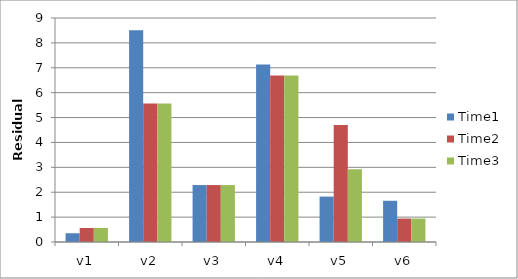
| Category | Time1 | Time2 | Time3 |
|---|---|---|---|
| v1 | 0.351 | 0.562 | 0.562 |
| v2 | 8.506 | 5.563 | 5.563 |
| v3 | 2.288 | 2.288 | 2.288 |
| v4 | 7.134 | 6.694 | 6.694 |
| v5 | 1.825 | 4.705 | 2.921 |
| v6 | 1.656 | 0.942 | 0.942 |